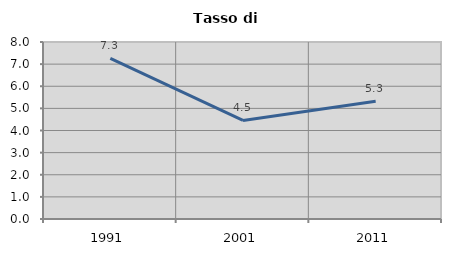
| Category | Tasso di disoccupazione   |
|---|---|
| 1991.0 | 7.256 |
| 2001.0 | 4.456 |
| 2011.0 | 5.322 |